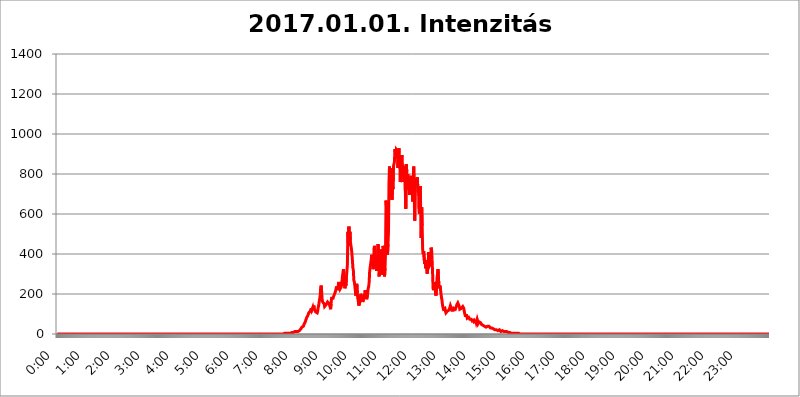
| Category | 2017.01.01. Intenzitás [W/m^2] |
|---|---|
| 0.0 | 0 |
| 0.0006944444444444445 | 0 |
| 0.001388888888888889 | 0 |
| 0.0020833333333333333 | 0 |
| 0.002777777777777778 | 0 |
| 0.003472222222222222 | 0 |
| 0.004166666666666667 | 0 |
| 0.004861111111111111 | 0 |
| 0.005555555555555556 | 0 |
| 0.0062499999999999995 | 0 |
| 0.006944444444444444 | 0 |
| 0.007638888888888889 | 0 |
| 0.008333333333333333 | 0 |
| 0.009027777777777779 | 0 |
| 0.009722222222222222 | 0 |
| 0.010416666666666666 | 0 |
| 0.011111111111111112 | 0 |
| 0.011805555555555555 | 0 |
| 0.012499999999999999 | 0 |
| 0.013194444444444444 | 0 |
| 0.013888888888888888 | 0 |
| 0.014583333333333332 | 0 |
| 0.015277777777777777 | 0 |
| 0.015972222222222224 | 0 |
| 0.016666666666666666 | 0 |
| 0.017361111111111112 | 0 |
| 0.018055555555555557 | 0 |
| 0.01875 | 0 |
| 0.019444444444444445 | 0 |
| 0.02013888888888889 | 0 |
| 0.020833333333333332 | 0 |
| 0.02152777777777778 | 0 |
| 0.022222222222222223 | 0 |
| 0.02291666666666667 | 0 |
| 0.02361111111111111 | 0 |
| 0.024305555555555556 | 0 |
| 0.024999999999999998 | 0 |
| 0.025694444444444447 | 0 |
| 0.02638888888888889 | 0 |
| 0.027083333333333334 | 0 |
| 0.027777777777777776 | 0 |
| 0.02847222222222222 | 0 |
| 0.029166666666666664 | 0 |
| 0.029861111111111113 | 0 |
| 0.030555555555555555 | 0 |
| 0.03125 | 0 |
| 0.03194444444444445 | 0 |
| 0.03263888888888889 | 0 |
| 0.03333333333333333 | 0 |
| 0.034027777777777775 | 0 |
| 0.034722222222222224 | 0 |
| 0.035416666666666666 | 0 |
| 0.036111111111111115 | 0 |
| 0.03680555555555556 | 0 |
| 0.0375 | 0 |
| 0.03819444444444444 | 0 |
| 0.03888888888888889 | 0 |
| 0.03958333333333333 | 0 |
| 0.04027777777777778 | 0 |
| 0.04097222222222222 | 0 |
| 0.041666666666666664 | 0 |
| 0.042361111111111106 | 0 |
| 0.04305555555555556 | 0 |
| 0.043750000000000004 | 0 |
| 0.044444444444444446 | 0 |
| 0.04513888888888889 | 0 |
| 0.04583333333333334 | 0 |
| 0.04652777777777778 | 0 |
| 0.04722222222222222 | 0 |
| 0.04791666666666666 | 0 |
| 0.04861111111111111 | 0 |
| 0.049305555555555554 | 0 |
| 0.049999999999999996 | 0 |
| 0.05069444444444445 | 0 |
| 0.051388888888888894 | 0 |
| 0.052083333333333336 | 0 |
| 0.05277777777777778 | 0 |
| 0.05347222222222222 | 0 |
| 0.05416666666666667 | 0 |
| 0.05486111111111111 | 0 |
| 0.05555555555555555 | 0 |
| 0.05625 | 0 |
| 0.05694444444444444 | 0 |
| 0.057638888888888885 | 0 |
| 0.05833333333333333 | 0 |
| 0.05902777777777778 | 0 |
| 0.059722222222222225 | 0 |
| 0.06041666666666667 | 0 |
| 0.061111111111111116 | 0 |
| 0.06180555555555556 | 0 |
| 0.0625 | 0 |
| 0.06319444444444444 | 0 |
| 0.06388888888888888 | 0 |
| 0.06458333333333334 | 0 |
| 0.06527777777777778 | 0 |
| 0.06597222222222222 | 0 |
| 0.06666666666666667 | 0 |
| 0.06736111111111111 | 0 |
| 0.06805555555555555 | 0 |
| 0.06874999999999999 | 0 |
| 0.06944444444444443 | 0 |
| 0.07013888888888889 | 0 |
| 0.07083333333333333 | 0 |
| 0.07152777777777779 | 0 |
| 0.07222222222222223 | 0 |
| 0.07291666666666667 | 0 |
| 0.07361111111111111 | 0 |
| 0.07430555555555556 | 0 |
| 0.075 | 0 |
| 0.07569444444444444 | 0 |
| 0.0763888888888889 | 0 |
| 0.07708333333333334 | 0 |
| 0.07777777777777778 | 0 |
| 0.07847222222222222 | 0 |
| 0.07916666666666666 | 0 |
| 0.0798611111111111 | 0 |
| 0.08055555555555556 | 0 |
| 0.08125 | 0 |
| 0.08194444444444444 | 0 |
| 0.08263888888888889 | 0 |
| 0.08333333333333333 | 0 |
| 0.08402777777777777 | 0 |
| 0.08472222222222221 | 0 |
| 0.08541666666666665 | 0 |
| 0.08611111111111112 | 0 |
| 0.08680555555555557 | 0 |
| 0.08750000000000001 | 0 |
| 0.08819444444444445 | 0 |
| 0.08888888888888889 | 0 |
| 0.08958333333333333 | 0 |
| 0.09027777777777778 | 0 |
| 0.09097222222222222 | 0 |
| 0.09166666666666667 | 0 |
| 0.09236111111111112 | 0 |
| 0.09305555555555556 | 0 |
| 0.09375 | 0 |
| 0.09444444444444444 | 0 |
| 0.09513888888888888 | 0 |
| 0.09583333333333333 | 0 |
| 0.09652777777777777 | 0 |
| 0.09722222222222222 | 0 |
| 0.09791666666666667 | 0 |
| 0.09861111111111111 | 0 |
| 0.09930555555555555 | 0 |
| 0.09999999999999999 | 0 |
| 0.10069444444444443 | 0 |
| 0.1013888888888889 | 0 |
| 0.10208333333333335 | 0 |
| 0.10277777777777779 | 0 |
| 0.10347222222222223 | 0 |
| 0.10416666666666667 | 0 |
| 0.10486111111111111 | 0 |
| 0.10555555555555556 | 0 |
| 0.10625 | 0 |
| 0.10694444444444444 | 0 |
| 0.1076388888888889 | 0 |
| 0.10833333333333334 | 0 |
| 0.10902777777777778 | 0 |
| 0.10972222222222222 | 0 |
| 0.1111111111111111 | 0 |
| 0.11180555555555556 | 0 |
| 0.11180555555555556 | 0 |
| 0.1125 | 0 |
| 0.11319444444444444 | 0 |
| 0.11388888888888889 | 0 |
| 0.11458333333333333 | 0 |
| 0.11527777777777777 | 0 |
| 0.11597222222222221 | 0 |
| 0.11666666666666665 | 0 |
| 0.1173611111111111 | 0 |
| 0.11805555555555557 | 0 |
| 0.11944444444444445 | 0 |
| 0.12013888888888889 | 0 |
| 0.12083333333333333 | 0 |
| 0.12152777777777778 | 0 |
| 0.12222222222222223 | 0 |
| 0.12291666666666667 | 0 |
| 0.12291666666666667 | 0 |
| 0.12361111111111112 | 0 |
| 0.12430555555555556 | 0 |
| 0.125 | 0 |
| 0.12569444444444444 | 0 |
| 0.12638888888888888 | 0 |
| 0.12708333333333333 | 0 |
| 0.16875 | 0 |
| 0.12847222222222224 | 0 |
| 0.12916666666666668 | 0 |
| 0.12986111111111112 | 0 |
| 0.13055555555555556 | 0 |
| 0.13125 | 0 |
| 0.13194444444444445 | 0 |
| 0.1326388888888889 | 0 |
| 0.13333333333333333 | 0 |
| 0.13402777777777777 | 0 |
| 0.13402777777777777 | 0 |
| 0.13472222222222222 | 0 |
| 0.13541666666666666 | 0 |
| 0.1361111111111111 | 0 |
| 0.13749999999999998 | 0 |
| 0.13819444444444443 | 0 |
| 0.1388888888888889 | 0 |
| 0.13958333333333334 | 0 |
| 0.14027777777777778 | 0 |
| 0.14097222222222222 | 0 |
| 0.14166666666666666 | 0 |
| 0.1423611111111111 | 0 |
| 0.14305555555555557 | 0 |
| 0.14375000000000002 | 0 |
| 0.14444444444444446 | 0 |
| 0.1451388888888889 | 0 |
| 0.1451388888888889 | 0 |
| 0.14652777777777778 | 0 |
| 0.14722222222222223 | 0 |
| 0.14791666666666667 | 0 |
| 0.1486111111111111 | 0 |
| 0.14930555555555555 | 0 |
| 0.15 | 0 |
| 0.15069444444444444 | 0 |
| 0.15138888888888888 | 0 |
| 0.15208333333333332 | 0 |
| 0.15277777777777776 | 0 |
| 0.15347222222222223 | 0 |
| 0.15416666666666667 | 0 |
| 0.15486111111111112 | 0 |
| 0.15555555555555556 | 0 |
| 0.15625 | 0 |
| 0.15694444444444444 | 0 |
| 0.15763888888888888 | 0 |
| 0.15833333333333333 | 0 |
| 0.15902777777777777 | 0 |
| 0.15972222222222224 | 0 |
| 0.16041666666666668 | 0 |
| 0.16111111111111112 | 0 |
| 0.16180555555555556 | 0 |
| 0.1625 | 0 |
| 0.16319444444444445 | 0 |
| 0.1638888888888889 | 0 |
| 0.16458333333333333 | 0 |
| 0.16527777777777777 | 0 |
| 0.16597222222222222 | 0 |
| 0.16666666666666666 | 0 |
| 0.1673611111111111 | 0 |
| 0.16805555555555554 | 0 |
| 0.16874999999999998 | 0 |
| 0.16944444444444443 | 0 |
| 0.17013888888888887 | 0 |
| 0.1708333333333333 | 0 |
| 0.17152777777777775 | 0 |
| 0.17222222222222225 | 0 |
| 0.1729166666666667 | 0 |
| 0.17361111111111113 | 0 |
| 0.17430555555555557 | 0 |
| 0.17500000000000002 | 0 |
| 0.17569444444444446 | 0 |
| 0.1763888888888889 | 0 |
| 0.17708333333333334 | 0 |
| 0.17777777777777778 | 0 |
| 0.17847222222222223 | 0 |
| 0.17916666666666667 | 0 |
| 0.1798611111111111 | 0 |
| 0.18055555555555555 | 0 |
| 0.18125 | 0 |
| 0.18194444444444444 | 0 |
| 0.1826388888888889 | 0 |
| 0.18333333333333335 | 0 |
| 0.1840277777777778 | 0 |
| 0.18472222222222223 | 0 |
| 0.18541666666666667 | 0 |
| 0.18611111111111112 | 0 |
| 0.18680555555555556 | 0 |
| 0.1875 | 0 |
| 0.18819444444444444 | 0 |
| 0.18888888888888888 | 0 |
| 0.18958333333333333 | 0 |
| 0.19027777777777777 | 0 |
| 0.1909722222222222 | 0 |
| 0.19166666666666665 | 0 |
| 0.19236111111111112 | 0 |
| 0.19305555555555554 | 0 |
| 0.19375 | 0 |
| 0.19444444444444445 | 0 |
| 0.1951388888888889 | 0 |
| 0.19583333333333333 | 0 |
| 0.19652777777777777 | 0 |
| 0.19722222222222222 | 0 |
| 0.19791666666666666 | 0 |
| 0.1986111111111111 | 0 |
| 0.19930555555555554 | 0 |
| 0.19999999999999998 | 0 |
| 0.20069444444444443 | 0 |
| 0.20138888888888887 | 0 |
| 0.2020833333333333 | 0 |
| 0.2027777777777778 | 0 |
| 0.2034722222222222 | 0 |
| 0.2041666666666667 | 0 |
| 0.20486111111111113 | 0 |
| 0.20555555555555557 | 0 |
| 0.20625000000000002 | 0 |
| 0.20694444444444446 | 0 |
| 0.2076388888888889 | 0 |
| 0.20833333333333334 | 0 |
| 0.20902777777777778 | 0 |
| 0.20972222222222223 | 0 |
| 0.21041666666666667 | 0 |
| 0.2111111111111111 | 0 |
| 0.21180555555555555 | 0 |
| 0.2125 | 0 |
| 0.21319444444444444 | 0 |
| 0.2138888888888889 | 0 |
| 0.21458333333333335 | 0 |
| 0.2152777777777778 | 0 |
| 0.21597222222222223 | 0 |
| 0.21666666666666667 | 0 |
| 0.21736111111111112 | 0 |
| 0.21805555555555556 | 0 |
| 0.21875 | 0 |
| 0.21944444444444444 | 0 |
| 0.22013888888888888 | 0 |
| 0.22083333333333333 | 0 |
| 0.22152777777777777 | 0 |
| 0.2222222222222222 | 0 |
| 0.22291666666666665 | 0 |
| 0.2236111111111111 | 0 |
| 0.22430555555555556 | 0 |
| 0.225 | 0 |
| 0.22569444444444445 | 0 |
| 0.2263888888888889 | 0 |
| 0.22708333333333333 | 0 |
| 0.22777777777777777 | 0 |
| 0.22847222222222222 | 0 |
| 0.22916666666666666 | 0 |
| 0.2298611111111111 | 0 |
| 0.23055555555555554 | 0 |
| 0.23124999999999998 | 0 |
| 0.23194444444444443 | 0 |
| 0.23263888888888887 | 0 |
| 0.2333333333333333 | 0 |
| 0.2340277777777778 | 0 |
| 0.2347222222222222 | 0 |
| 0.2354166666666667 | 0 |
| 0.23611111111111113 | 0 |
| 0.23680555555555557 | 0 |
| 0.23750000000000002 | 0 |
| 0.23819444444444446 | 0 |
| 0.2388888888888889 | 0 |
| 0.23958333333333334 | 0 |
| 0.24027777777777778 | 0 |
| 0.24097222222222223 | 0 |
| 0.24166666666666667 | 0 |
| 0.2423611111111111 | 0 |
| 0.24305555555555555 | 0 |
| 0.24375 | 0 |
| 0.24444444444444446 | 0 |
| 0.24513888888888888 | 0 |
| 0.24583333333333335 | 0 |
| 0.2465277777777778 | 0 |
| 0.24722222222222223 | 0 |
| 0.24791666666666667 | 0 |
| 0.24861111111111112 | 0 |
| 0.24930555555555556 | 0 |
| 0.25 | 0 |
| 0.25069444444444444 | 0 |
| 0.2513888888888889 | 0 |
| 0.2520833333333333 | 0 |
| 0.25277777777777777 | 0 |
| 0.2534722222222222 | 0 |
| 0.25416666666666665 | 0 |
| 0.2548611111111111 | 0 |
| 0.2555555555555556 | 0 |
| 0.25625000000000003 | 0 |
| 0.2569444444444445 | 0 |
| 0.2576388888888889 | 0 |
| 0.25833333333333336 | 0 |
| 0.2590277777777778 | 0 |
| 0.25972222222222224 | 0 |
| 0.2604166666666667 | 0 |
| 0.2611111111111111 | 0 |
| 0.26180555555555557 | 0 |
| 0.2625 | 0 |
| 0.26319444444444445 | 0 |
| 0.2638888888888889 | 0 |
| 0.26458333333333334 | 0 |
| 0.2652777777777778 | 0 |
| 0.2659722222222222 | 0 |
| 0.26666666666666666 | 0 |
| 0.2673611111111111 | 0 |
| 0.26805555555555555 | 0 |
| 0.26875 | 0 |
| 0.26944444444444443 | 0 |
| 0.2701388888888889 | 0 |
| 0.2708333333333333 | 0 |
| 0.27152777777777776 | 0 |
| 0.2722222222222222 | 0 |
| 0.27291666666666664 | 0 |
| 0.2736111111111111 | 0 |
| 0.2743055555555555 | 0 |
| 0.27499999999999997 | 0 |
| 0.27569444444444446 | 0 |
| 0.27638888888888885 | 0 |
| 0.27708333333333335 | 0 |
| 0.2777777777777778 | 0 |
| 0.27847222222222223 | 0 |
| 0.2791666666666667 | 0 |
| 0.2798611111111111 | 0 |
| 0.28055555555555556 | 0 |
| 0.28125 | 0 |
| 0.28194444444444444 | 0 |
| 0.2826388888888889 | 0 |
| 0.2833333333333333 | 0 |
| 0.28402777777777777 | 0 |
| 0.2847222222222222 | 0 |
| 0.28541666666666665 | 0 |
| 0.28611111111111115 | 0 |
| 0.28680555555555554 | 0 |
| 0.28750000000000003 | 0 |
| 0.2881944444444445 | 0 |
| 0.2888888888888889 | 0 |
| 0.28958333333333336 | 0 |
| 0.2902777777777778 | 0 |
| 0.29097222222222224 | 0 |
| 0.2916666666666667 | 0 |
| 0.2923611111111111 | 0 |
| 0.29305555555555557 | 0 |
| 0.29375 | 0 |
| 0.29444444444444445 | 0 |
| 0.2951388888888889 | 0 |
| 0.29583333333333334 | 0 |
| 0.2965277777777778 | 0 |
| 0.2972222222222222 | 0 |
| 0.29791666666666666 | 0 |
| 0.2986111111111111 | 0 |
| 0.29930555555555555 | 0 |
| 0.3 | 0 |
| 0.30069444444444443 | 0 |
| 0.3013888888888889 | 0 |
| 0.3020833333333333 | 0 |
| 0.30277777777777776 | 0 |
| 0.3034722222222222 | 0 |
| 0.30416666666666664 | 0 |
| 0.3048611111111111 | 0 |
| 0.3055555555555555 | 0 |
| 0.30624999999999997 | 0 |
| 0.3069444444444444 | 0 |
| 0.3076388888888889 | 0 |
| 0.30833333333333335 | 0 |
| 0.3090277777777778 | 0 |
| 0.30972222222222223 | 0 |
| 0.3104166666666667 | 0 |
| 0.3111111111111111 | 0 |
| 0.31180555555555556 | 0 |
| 0.3125 | 0 |
| 0.31319444444444444 | 0 |
| 0.3138888888888889 | 0 |
| 0.3145833333333333 | 0 |
| 0.31527777777777777 | 0 |
| 0.3159722222222222 | 0 |
| 0.31666666666666665 | 0 |
| 0.31736111111111115 | 3.525 |
| 0.31805555555555554 | 3.525 |
| 0.31875000000000003 | 3.525 |
| 0.3194444444444445 | 3.525 |
| 0.3201388888888889 | 3.525 |
| 0.32083333333333336 | 3.525 |
| 0.3215277777777778 | 3.525 |
| 0.32222222222222224 | 3.525 |
| 0.3229166666666667 | 3.525 |
| 0.3236111111111111 | 3.525 |
| 0.32430555555555557 | 3.525 |
| 0.325 | 3.525 |
| 0.32569444444444445 | 3.525 |
| 0.3263888888888889 | 7.887 |
| 0.32708333333333334 | 3.525 |
| 0.3277777777777778 | 7.887 |
| 0.3284722222222222 | 7.887 |
| 0.32916666666666666 | 7.887 |
| 0.3298611111111111 | 7.887 |
| 0.33055555555555555 | 7.887 |
| 0.33125 | 7.887 |
| 0.33194444444444443 | 12.257 |
| 0.3326388888888889 | 12.257 |
| 0.3333333333333333 | 12.257 |
| 0.3340277777777778 | 12.257 |
| 0.3347222222222222 | 12.257 |
| 0.3354166666666667 | 12.257 |
| 0.3361111111111111 | 12.257 |
| 0.3368055555555556 | 12.257 |
| 0.33749999999999997 | 12.257 |
| 0.33819444444444446 | 16.636 |
| 0.33888888888888885 | 16.636 |
| 0.33958333333333335 | 16.636 |
| 0.34027777777777773 | 21.024 |
| 0.34097222222222223 | 21.024 |
| 0.3416666666666666 | 25.419 |
| 0.3423611111111111 | 29.823 |
| 0.3430555555555555 | 34.234 |
| 0.34375 | 38.653 |
| 0.3444444444444445 | 34.234 |
| 0.3451388888888889 | 38.653 |
| 0.3458333333333334 | 38.653 |
| 0.34652777777777777 | 51.951 |
| 0.34722222222222227 | 56.398 |
| 0.34791666666666665 | 60.85 |
| 0.34861111111111115 | 69.775 |
| 0.34930555555555554 | 74.246 |
| 0.35000000000000003 | 83.205 |
| 0.3506944444444444 | 87.692 |
| 0.3513888888888889 | 92.184 |
| 0.3520833333333333 | 96.682 |
| 0.3527777777777778 | 105.69 |
| 0.3534722222222222 | 110.201 |
| 0.3541666666666667 | 110.201 |
| 0.3548611111111111 | 114.716 |
| 0.35555555555555557 | 105.69 |
| 0.35625 | 128.284 |
| 0.35694444444444445 | 119.235 |
| 0.3576388888888889 | 123.758 |
| 0.35833333333333334 | 132.814 |
| 0.3590277777777778 | 119.235 |
| 0.3597222222222222 | 141.884 |
| 0.36041666666666666 | 128.284 |
| 0.3611111111111111 | 119.235 |
| 0.36180555555555555 | 119.235 |
| 0.3625 | 110.201 |
| 0.36319444444444443 | 105.69 |
| 0.3638888888888889 | 105.69 |
| 0.3645833333333333 | 105.69 |
| 0.3652777777777778 | 114.716 |
| 0.3659722222222222 | 132.814 |
| 0.3666666666666667 | 141.884 |
| 0.3673611111111111 | 160.056 |
| 0.3680555555555556 | 173.709 |
| 0.36874999999999997 | 191.937 |
| 0.36944444444444446 | 228.436 |
| 0.37013888888888885 | 242.127 |
| 0.37083333333333335 | 210.182 |
| 0.37152777777777773 | 173.709 |
| 0.37222222222222223 | 160.056 |
| 0.3729166666666666 | 164.605 |
| 0.3736111111111111 | 155.509 |
| 0.3743055555555555 | 150.964 |
| 0.375 | 137.347 |
| 0.3756944444444445 | 132.814 |
| 0.3763888888888889 | 132.814 |
| 0.3770833333333334 | 146.423 |
| 0.37777777777777777 | 146.423 |
| 0.37847222222222227 | 150.964 |
| 0.37916666666666665 | 160.056 |
| 0.37986111111111115 | 160.056 |
| 0.38055555555555554 | 155.509 |
| 0.38125000000000003 | 150.964 |
| 0.3819444444444444 | 160.056 |
| 0.3826388888888889 | 137.347 |
| 0.3833333333333333 | 123.758 |
| 0.3840277777777778 | 150.964 |
| 0.3847222222222222 | 178.264 |
| 0.3854166666666667 | 173.709 |
| 0.3861111111111111 | 173.709 |
| 0.38680555555555557 | 178.264 |
| 0.3875 | 187.378 |
| 0.38819444444444445 | 182.82 |
| 0.3888888888888889 | 191.937 |
| 0.38958333333333334 | 205.62 |
| 0.3902777777777778 | 210.182 |
| 0.3909722222222222 | 223.873 |
| 0.39166666666666666 | 237.564 |
| 0.3923611111111111 | 237.564 |
| 0.39305555555555555 | 219.309 |
| 0.39375 | 233 |
| 0.39444444444444443 | 251.251 |
| 0.3951388888888889 | 260.373 |
| 0.3958333333333333 | 233 |
| 0.3965277777777778 | 223.873 |
| 0.3972222222222222 | 223.873 |
| 0.3979166666666667 | 233 |
| 0.3986111111111111 | 242.127 |
| 0.3993055555555556 | 260.373 |
| 0.39999999999999997 | 287.709 |
| 0.40069444444444446 | 287.709 |
| 0.40138888888888885 | 324.052 |
| 0.40208333333333335 | 292.259 |
| 0.40277777777777773 | 251.251 |
| 0.40347222222222223 | 228.436 |
| 0.4041666666666666 | 251.251 |
| 0.4048611111111111 | 242.127 |
| 0.4055555555555555 | 283.156 |
| 0.40625 | 314.98 |
| 0.4069444444444445 | 346.682 |
| 0.4076388888888889 | 510.885 |
| 0.4083333333333334 | 453.968 |
| 0.40902777777777777 | 536.82 |
| 0.40972222222222227 | 440.702 |
| 0.41041666666666665 | 510.885 |
| 0.41111111111111115 | 462.786 |
| 0.41180555555555554 | 458.38 |
| 0.41250000000000003 | 427.39 |
| 0.4131944444444444 | 405.108 |
| 0.4138888888888889 | 373.729 |
| 0.4145833333333333 | 333.113 |
| 0.4152777777777778 | 319.517 |
| 0.4159722222222222 | 269.49 |
| 0.4166666666666667 | 260.373 |
| 0.4173611111111111 | 255.813 |
| 0.41805555555555557 | 219.309 |
| 0.41875 | 191.937 |
| 0.41944444444444445 | 210.182 |
| 0.4201388888888889 | 251.251 |
| 0.42083333333333334 | 201.058 |
| 0.4215277777777778 | 178.264 |
| 0.4222222222222222 | 164.605 |
| 0.42291666666666666 | 141.884 |
| 0.4236111111111111 | 141.884 |
| 0.42430555555555555 | 141.884 |
| 0.425 | 169.156 |
| 0.42569444444444443 | 201.058 |
| 0.4263888888888889 | 205.62 |
| 0.4270833333333333 | 201.058 |
| 0.4277777777777778 | 173.709 |
| 0.4284722222222222 | 160.056 |
| 0.4291666666666667 | 164.605 |
| 0.4298611111111111 | 178.264 |
| 0.4305555555555556 | 191.937 |
| 0.43124999999999997 | 201.058 |
| 0.43194444444444446 | 219.309 |
| 0.43263888888888885 | 196.497 |
| 0.43333333333333335 | 187.378 |
| 0.43402777777777773 | 173.709 |
| 0.43472222222222223 | 178.264 |
| 0.4354166666666666 | 205.62 |
| 0.4361111111111111 | 228.436 |
| 0.4368055555555555 | 237.564 |
| 0.4375 | 260.373 |
| 0.4381944444444445 | 314.98 |
| 0.4388888888888889 | 333.113 |
| 0.4395833333333334 | 333.113 |
| 0.44027777777777777 | 369.23 |
| 0.44097222222222227 | 396.164 |
| 0.44166666666666665 | 396.164 |
| 0.44236111111111115 | 355.712 |
| 0.44305555555555554 | 324.052 |
| 0.44375000000000003 | 346.682 |
| 0.4444444444444444 | 431.833 |
| 0.4451388888888889 | 440.702 |
| 0.4458333333333333 | 405.108 |
| 0.4465277777777778 | 382.715 |
| 0.4472222222222222 | 378.224 |
| 0.4479166666666667 | 314.98 |
| 0.4486111111111111 | 310.44 |
| 0.44930555555555557 | 373.729 |
| 0.45 | 449.551 |
| 0.45069444444444445 | 360.221 |
| 0.4513888888888889 | 287.709 |
| 0.45208333333333334 | 292.259 |
| 0.4527777777777778 | 337.639 |
| 0.4534722222222222 | 422.943 |
| 0.45416666666666666 | 342.162 |
| 0.4548611111111111 | 310.44 |
| 0.45555555555555555 | 296.808 |
| 0.45625 | 355.712 |
| 0.45694444444444443 | 440.702 |
| 0.4576388888888889 | 422.943 |
| 0.4583333333333333 | 337.639 |
| 0.4590277777777778 | 287.709 |
| 0.4597222222222222 | 328.584 |
| 0.4604166666666667 | 414.035 |
| 0.4611111111111111 | 667.123 |
| 0.4618055555555556 | 634.105 |
| 0.46249999999999997 | 414.035 |
| 0.46319444444444446 | 396.164 |
| 0.46388888888888885 | 449.551 |
| 0.46458333333333335 | 510.885 |
| 0.46527777777777773 | 759.723 |
| 0.46597222222222223 | 837.682 |
| 0.4666666666666666 | 735.89 |
| 0.4673611111111111 | 691.608 |
| 0.4680555555555555 | 727.896 |
| 0.46875 | 829.981 |
| 0.4694444444444445 | 671.22 |
| 0.4701388888888889 | 743.859 |
| 0.4708333333333334 | 723.889 |
| 0.47152777777777777 | 837.682 |
| 0.47222222222222227 | 837.682 |
| 0.47291666666666665 | 860.676 |
| 0.47361111111111115 | 925.06 |
| 0.47430555555555554 | 909.996 |
| 0.47500000000000003 | 883.516 |
| 0.4756944444444444 | 921.298 |
| 0.4763888888888889 | 925.06 |
| 0.4770833333333333 | 913.766 |
| 0.4777777777777778 | 829.981 |
| 0.4784722222222222 | 883.516 |
| 0.4791666666666667 | 928.819 |
| 0.4798611111111111 | 853.029 |
| 0.48055555555555557 | 891.099 |
| 0.48125 | 759.723 |
| 0.48194444444444445 | 775.492 |
| 0.4826388888888889 | 872.114 |
| 0.48333333333333334 | 894.885 |
| 0.4840277777777778 | 818.392 |
| 0.4847222222222222 | 829.981 |
| 0.48541666666666666 | 822.26 |
| 0.4861111111111111 | 759.723 |
| 0.48680555555555555 | 814.519 |
| 0.4875 | 841.526 |
| 0.48819444444444443 | 719.877 |
| 0.4888888888888889 | 625.784 |
| 0.4895833333333333 | 849.199 |
| 0.4902777777777778 | 806.757 |
| 0.4909722222222222 | 727.896 |
| 0.4916666666666667 | 798.974 |
| 0.4923611111111111 | 731.896 |
| 0.4930555555555556 | 723.889 |
| 0.49374999999999997 | 731.896 |
| 0.49444444444444446 | 695.666 |
| 0.49513888888888885 | 691.608 |
| 0.49583333333333335 | 783.342 |
| 0.49652777777777773 | 791.169 |
| 0.49722222222222223 | 759.723 |
| 0.4979166666666666 | 787.258 |
| 0.4986111111111111 | 663.019 |
| 0.4993055555555555 | 763.674 |
| 0.5 | 837.682 |
| 0.5006944444444444 | 695.666 |
| 0.5013888888888889 | 566.793 |
| 0.5020833333333333 | 779.42 |
| 0.5027777777777778 | 759.723 |
| 0.5034722222222222 | 767.62 |
| 0.5041666666666667 | 743.859 |
| 0.5048611111111111 | 783.342 |
| 0.5055555555555555 | 743.859 |
| 0.50625 | 707.8 |
| 0.5069444444444444 | 735.89 |
| 0.5076388888888889 | 609.062 |
| 0.5083333333333333 | 600.661 |
| 0.5090277777777777 | 739.877 |
| 0.5097222222222222 | 621.613 |
| 0.5104166666666666 | 480.356 |
| 0.5111111111111112 | 634.105 |
| 0.5118055555555555 | 541.121 |
| 0.5125000000000001 | 422.943 |
| 0.5131944444444444 | 400.638 |
| 0.513888888888889 | 414.035 |
| 0.5145833333333333 | 418.492 |
| 0.5152777777777778 | 351.198 |
| 0.5159722222222222 | 369.23 |
| 0.5166666666666667 | 328.584 |
| 0.517361111111111 | 346.682 |
| 0.5180555555555556 | 328.584 |
| 0.5187499999999999 | 301.354 |
| 0.5194444444444445 | 296.808 |
| 0.5201388888888888 | 342.162 |
| 0.5208333333333334 | 409.574 |
| 0.5215277777777778 | 378.224 |
| 0.5222222222222223 | 342.162 |
| 0.5229166666666667 | 337.639 |
| 0.5236111111111111 | 351.198 |
| 0.5243055555555556 | 431.833 |
| 0.525 | 422.943 |
| 0.5256944444444445 | 373.729 |
| 0.5263888888888889 | 310.44 |
| 0.5270833333333333 | 228.436 |
| 0.5277777777777778 | 219.309 |
| 0.5284722222222222 | 242.127 |
| 0.5291666666666667 | 260.373 |
| 0.5298611111111111 | 242.127 |
| 0.5305555555555556 | 201.058 |
| 0.53125 | 191.937 |
| 0.5319444444444444 | 228.436 |
| 0.5326388888888889 | 278.603 |
| 0.5333333333333333 | 301.354 |
| 0.5340277777777778 | 324.052 |
| 0.5347222222222222 | 324.052 |
| 0.5354166666666667 | 228.436 |
| 0.5361111111111111 | 228.436 |
| 0.5368055555555555 | 242.127 |
| 0.5375 | 223.873 |
| 0.5381944444444444 | 201.058 |
| 0.5388888888888889 | 182.82 |
| 0.5395833333333333 | 169.156 |
| 0.5402777777777777 | 146.423 |
| 0.5409722222222222 | 132.814 |
| 0.5416666666666666 | 123.758 |
| 0.5423611111111112 | 128.284 |
| 0.5430555555555555 | 128.284 |
| 0.5437500000000001 | 128.284 |
| 0.5444444444444444 | 114.716 |
| 0.545138888888889 | 105.69 |
| 0.5458333333333333 | 105.69 |
| 0.5465277777777778 | 110.201 |
| 0.5472222222222222 | 114.716 |
| 0.5479166666666667 | 119.235 |
| 0.548611111111111 | 119.235 |
| 0.5493055555555556 | 119.235 |
| 0.5499999999999999 | 119.235 |
| 0.5506944444444445 | 132.814 |
| 0.5513888888888888 | 141.884 |
| 0.5520833333333334 | 137.347 |
| 0.5527777777777778 | 128.284 |
| 0.5534722222222223 | 119.235 |
| 0.5541666666666667 | 114.716 |
| 0.5548611111111111 | 114.716 |
| 0.5555555555555556 | 119.235 |
| 0.55625 | 128.284 |
| 0.5569444444444445 | 128.284 |
| 0.5576388888888889 | 123.758 |
| 0.5583333333333333 | 123.758 |
| 0.5590277777777778 | 128.284 |
| 0.5597222222222222 | 137.347 |
| 0.5604166666666667 | 146.423 |
| 0.5611111111111111 | 146.423 |
| 0.5618055555555556 | 155.509 |
| 0.5625 | 150.964 |
| 0.5631944444444444 | 150.964 |
| 0.5638888888888889 | 137.347 |
| 0.5645833333333333 | 123.758 |
| 0.5652777777777778 | 128.284 |
| 0.5659722222222222 | 128.284 |
| 0.5666666666666667 | 128.284 |
| 0.5673611111111111 | 128.284 |
| 0.5680555555555555 | 132.814 |
| 0.56875 | 137.347 |
| 0.5694444444444444 | 132.814 |
| 0.5701388888888889 | 128.284 |
| 0.5708333333333333 | 114.716 |
| 0.5715277777777777 | 101.184 |
| 0.5722222222222222 | 92.184 |
| 0.5729166666666666 | 87.692 |
| 0.5736111111111112 | 92.184 |
| 0.5743055555555555 | 92.184 |
| 0.5750000000000001 | 78.722 |
| 0.5756944444444444 | 74.246 |
| 0.576388888888889 | 78.722 |
| 0.5770833333333333 | 83.205 |
| 0.5777777777777778 | 78.722 |
| 0.5784722222222222 | 74.246 |
| 0.5791666666666667 | 74.246 |
| 0.579861111111111 | 78.722 |
| 0.5805555555555556 | 74.246 |
| 0.5812499999999999 | 69.775 |
| 0.5819444444444445 | 65.31 |
| 0.5826388888888888 | 65.31 |
| 0.5833333333333334 | 69.775 |
| 0.5840277777777778 | 69.775 |
| 0.5847222222222223 | 60.85 |
| 0.5854166666666667 | 60.85 |
| 0.5861111111111111 | 60.85 |
| 0.5868055555555556 | 65.31 |
| 0.5875 | 56.398 |
| 0.5881944444444445 | 56.398 |
| 0.5888888888888889 | 74.246 |
| 0.5895833333333333 | 65.31 |
| 0.5902777777777778 | 51.951 |
| 0.5909722222222222 | 56.398 |
| 0.5916666666666667 | 60.85 |
| 0.5923611111111111 | 60.85 |
| 0.5930555555555556 | 56.398 |
| 0.59375 | 56.398 |
| 0.5944444444444444 | 56.398 |
| 0.5951388888888889 | 47.511 |
| 0.5958333333333333 | 47.511 |
| 0.5965277777777778 | 43.079 |
| 0.5972222222222222 | 43.079 |
| 0.5979166666666667 | 38.653 |
| 0.5986111111111111 | 38.653 |
| 0.5993055555555555 | 38.653 |
| 0.6 | 38.653 |
| 0.6006944444444444 | 34.234 |
| 0.6013888888888889 | 34.234 |
| 0.6020833333333333 | 38.653 |
| 0.6027777777777777 | 38.653 |
| 0.6034722222222222 | 38.653 |
| 0.6041666666666666 | 38.653 |
| 0.6048611111111112 | 38.653 |
| 0.6055555555555555 | 38.653 |
| 0.6062500000000001 | 38.653 |
| 0.6069444444444444 | 34.234 |
| 0.607638888888889 | 29.823 |
| 0.6083333333333333 | 29.823 |
| 0.6090277777777778 | 29.823 |
| 0.6097222222222222 | 29.823 |
| 0.6104166666666667 | 25.419 |
| 0.611111111111111 | 25.419 |
| 0.6118055555555556 | 25.419 |
| 0.6124999999999999 | 25.419 |
| 0.6131944444444445 | 21.024 |
| 0.6138888888888888 | 21.024 |
| 0.6145833333333334 | 21.024 |
| 0.6152777777777778 | 21.024 |
| 0.6159722222222223 | 21.024 |
| 0.6166666666666667 | 21.024 |
| 0.6173611111111111 | 21.024 |
| 0.6180555555555556 | 16.636 |
| 0.61875 | 16.636 |
| 0.6194444444444445 | 16.636 |
| 0.6201388888888889 | 21.024 |
| 0.6208333333333333 | 21.024 |
| 0.6215277777777778 | 16.636 |
| 0.6222222222222222 | 12.257 |
| 0.6229166666666667 | 12.257 |
| 0.6236111111111111 | 16.636 |
| 0.6243055555555556 | 16.636 |
| 0.625 | 12.257 |
| 0.6256944444444444 | 12.257 |
| 0.6263888888888889 | 12.257 |
| 0.6270833333333333 | 12.257 |
| 0.6277777777777778 | 12.257 |
| 0.6284722222222222 | 12.257 |
| 0.6291666666666667 | 12.257 |
| 0.6298611111111111 | 12.257 |
| 0.6305555555555555 | 12.257 |
| 0.63125 | 7.887 |
| 0.6319444444444444 | 7.887 |
| 0.6326388888888889 | 7.887 |
| 0.6333333333333333 | 7.887 |
| 0.6340277777777777 | 7.887 |
| 0.6347222222222222 | 7.887 |
| 0.6354166666666666 | 7.887 |
| 0.6361111111111112 | 7.887 |
| 0.6368055555555555 | 3.525 |
| 0.6375000000000001 | 3.525 |
| 0.6381944444444444 | 3.525 |
| 0.638888888888889 | 3.525 |
| 0.6395833333333333 | 3.525 |
| 0.6402777777777778 | 3.525 |
| 0.6409722222222222 | 3.525 |
| 0.6416666666666667 | 3.525 |
| 0.642361111111111 | 3.525 |
| 0.6430555555555556 | 3.525 |
| 0.6437499999999999 | 3.525 |
| 0.6444444444444445 | 3.525 |
| 0.6451388888888888 | 3.525 |
| 0.6458333333333334 | 3.525 |
| 0.6465277777777778 | 3.525 |
| 0.6472222222222223 | 3.525 |
| 0.6479166666666667 | 3.525 |
| 0.6486111111111111 | 3.525 |
| 0.6493055555555556 | 0 |
| 0.65 | 3.525 |
| 0.6506944444444445 | 0 |
| 0.6513888888888889 | 0 |
| 0.6520833333333333 | 0 |
| 0.6527777777777778 | 0 |
| 0.6534722222222222 | 0 |
| 0.6541666666666667 | 0 |
| 0.6548611111111111 | 0 |
| 0.6555555555555556 | 0 |
| 0.65625 | 0 |
| 0.6569444444444444 | 0 |
| 0.6576388888888889 | 0 |
| 0.6583333333333333 | 0 |
| 0.6590277777777778 | 0 |
| 0.6597222222222222 | 0 |
| 0.6604166666666667 | 0 |
| 0.6611111111111111 | 0 |
| 0.6618055555555555 | 0 |
| 0.6625 | 0 |
| 0.6631944444444444 | 0 |
| 0.6638888888888889 | 0 |
| 0.6645833333333333 | 0 |
| 0.6652777777777777 | 0 |
| 0.6659722222222222 | 0 |
| 0.6666666666666666 | 0 |
| 0.6673611111111111 | 0 |
| 0.6680555555555556 | 0 |
| 0.6687500000000001 | 0 |
| 0.6694444444444444 | 0 |
| 0.6701388888888888 | 0 |
| 0.6708333333333334 | 0 |
| 0.6715277777777778 | 0 |
| 0.6722222222222222 | 0 |
| 0.6729166666666666 | 0 |
| 0.6736111111111112 | 0 |
| 0.6743055555555556 | 0 |
| 0.6749999999999999 | 0 |
| 0.6756944444444444 | 0 |
| 0.6763888888888889 | 0 |
| 0.6770833333333334 | 0 |
| 0.6777777777777777 | 0 |
| 0.6784722222222223 | 0 |
| 0.6791666666666667 | 0 |
| 0.6798611111111111 | 0 |
| 0.6805555555555555 | 0 |
| 0.68125 | 0 |
| 0.6819444444444445 | 0 |
| 0.6826388888888889 | 0 |
| 0.6833333333333332 | 0 |
| 0.6840277777777778 | 0 |
| 0.6847222222222222 | 0 |
| 0.6854166666666667 | 0 |
| 0.686111111111111 | 0 |
| 0.6868055555555556 | 0 |
| 0.6875 | 0 |
| 0.6881944444444444 | 0 |
| 0.688888888888889 | 0 |
| 0.6895833333333333 | 0 |
| 0.6902777777777778 | 0 |
| 0.6909722222222222 | 0 |
| 0.6916666666666668 | 0 |
| 0.6923611111111111 | 0 |
| 0.6930555555555555 | 0 |
| 0.69375 | 0 |
| 0.6944444444444445 | 0 |
| 0.6951388888888889 | 0 |
| 0.6958333333333333 | 0 |
| 0.6965277777777777 | 0 |
| 0.6972222222222223 | 0 |
| 0.6979166666666666 | 0 |
| 0.6986111111111111 | 0 |
| 0.6993055555555556 | 0 |
| 0.7000000000000001 | 0 |
| 0.7006944444444444 | 0 |
| 0.7013888888888888 | 0 |
| 0.7020833333333334 | 0 |
| 0.7027777777777778 | 0 |
| 0.7034722222222222 | 0 |
| 0.7041666666666666 | 0 |
| 0.7048611111111112 | 0 |
| 0.7055555555555556 | 0 |
| 0.7062499999999999 | 0 |
| 0.7069444444444444 | 0 |
| 0.7076388888888889 | 0 |
| 0.7083333333333334 | 0 |
| 0.7090277777777777 | 0 |
| 0.7097222222222223 | 0 |
| 0.7104166666666667 | 0 |
| 0.7111111111111111 | 0 |
| 0.7118055555555555 | 0 |
| 0.7125 | 0 |
| 0.7131944444444445 | 0 |
| 0.7138888888888889 | 0 |
| 0.7145833333333332 | 0 |
| 0.7152777777777778 | 0 |
| 0.7159722222222222 | 0 |
| 0.7166666666666667 | 0 |
| 0.717361111111111 | 0 |
| 0.7180555555555556 | 0 |
| 0.71875 | 0 |
| 0.7194444444444444 | 0 |
| 0.720138888888889 | 0 |
| 0.7208333333333333 | 0 |
| 0.7215277777777778 | 0 |
| 0.7222222222222222 | 0 |
| 0.7229166666666668 | 0 |
| 0.7236111111111111 | 0 |
| 0.7243055555555555 | 0 |
| 0.725 | 0 |
| 0.7256944444444445 | 0 |
| 0.7263888888888889 | 0 |
| 0.7270833333333333 | 0 |
| 0.7277777777777777 | 0 |
| 0.7284722222222223 | 0 |
| 0.7291666666666666 | 0 |
| 0.7298611111111111 | 0 |
| 0.7305555555555556 | 0 |
| 0.7312500000000001 | 0 |
| 0.7319444444444444 | 0 |
| 0.7326388888888888 | 0 |
| 0.7333333333333334 | 0 |
| 0.7340277777777778 | 0 |
| 0.7347222222222222 | 0 |
| 0.7354166666666666 | 0 |
| 0.7361111111111112 | 0 |
| 0.7368055555555556 | 0 |
| 0.7374999999999999 | 0 |
| 0.7381944444444444 | 0 |
| 0.7388888888888889 | 0 |
| 0.7395833333333334 | 0 |
| 0.7402777777777777 | 0 |
| 0.7409722222222223 | 0 |
| 0.7416666666666667 | 0 |
| 0.7423611111111111 | 0 |
| 0.7430555555555555 | 0 |
| 0.74375 | 0 |
| 0.7444444444444445 | 0 |
| 0.7451388888888889 | 0 |
| 0.7458333333333332 | 0 |
| 0.7465277777777778 | 0 |
| 0.7472222222222222 | 0 |
| 0.7479166666666667 | 0 |
| 0.748611111111111 | 0 |
| 0.7493055555555556 | 0 |
| 0.75 | 0 |
| 0.7506944444444444 | 0 |
| 0.751388888888889 | 0 |
| 0.7520833333333333 | 0 |
| 0.7527777777777778 | 0 |
| 0.7534722222222222 | 0 |
| 0.7541666666666668 | 0 |
| 0.7548611111111111 | 0 |
| 0.7555555555555555 | 0 |
| 0.75625 | 0 |
| 0.7569444444444445 | 0 |
| 0.7576388888888889 | 0 |
| 0.7583333333333333 | 0 |
| 0.7590277777777777 | 0 |
| 0.7597222222222223 | 0 |
| 0.7604166666666666 | 0 |
| 0.7611111111111111 | 0 |
| 0.7618055555555556 | 0 |
| 0.7625000000000001 | 0 |
| 0.7631944444444444 | 0 |
| 0.7638888888888888 | 0 |
| 0.7645833333333334 | 0 |
| 0.7652777777777778 | 0 |
| 0.7659722222222222 | 0 |
| 0.7666666666666666 | 0 |
| 0.7673611111111112 | 0 |
| 0.7680555555555556 | 0 |
| 0.7687499999999999 | 0 |
| 0.7694444444444444 | 0 |
| 0.7701388888888889 | 0 |
| 0.7708333333333334 | 0 |
| 0.7715277777777777 | 0 |
| 0.7722222222222223 | 0 |
| 0.7729166666666667 | 0 |
| 0.7736111111111111 | 0 |
| 0.7743055555555555 | 0 |
| 0.775 | 0 |
| 0.7756944444444445 | 0 |
| 0.7763888888888889 | 0 |
| 0.7770833333333332 | 0 |
| 0.7777777777777778 | 0 |
| 0.7784722222222222 | 0 |
| 0.7791666666666667 | 0 |
| 0.779861111111111 | 0 |
| 0.7805555555555556 | 0 |
| 0.78125 | 0 |
| 0.7819444444444444 | 0 |
| 0.782638888888889 | 0 |
| 0.7833333333333333 | 0 |
| 0.7840277777777778 | 0 |
| 0.7847222222222222 | 0 |
| 0.7854166666666668 | 0 |
| 0.7861111111111111 | 0 |
| 0.7868055555555555 | 0 |
| 0.7875 | 0 |
| 0.7881944444444445 | 0 |
| 0.7888888888888889 | 0 |
| 0.7895833333333333 | 0 |
| 0.7902777777777777 | 0 |
| 0.7909722222222223 | 0 |
| 0.7916666666666666 | 0 |
| 0.7923611111111111 | 0 |
| 0.7930555555555556 | 0 |
| 0.7937500000000001 | 0 |
| 0.7944444444444444 | 0 |
| 0.7951388888888888 | 0 |
| 0.7958333333333334 | 0 |
| 0.7965277777777778 | 0 |
| 0.7972222222222222 | 0 |
| 0.7979166666666666 | 0 |
| 0.7986111111111112 | 0 |
| 0.7993055555555556 | 0 |
| 0.7999999999999999 | 0 |
| 0.8006944444444444 | 0 |
| 0.8013888888888889 | 0 |
| 0.8020833333333334 | 0 |
| 0.8027777777777777 | 0 |
| 0.8034722222222223 | 0 |
| 0.8041666666666667 | 0 |
| 0.8048611111111111 | 0 |
| 0.8055555555555555 | 0 |
| 0.80625 | 0 |
| 0.8069444444444445 | 0 |
| 0.8076388888888889 | 0 |
| 0.8083333333333332 | 0 |
| 0.8090277777777778 | 0 |
| 0.8097222222222222 | 0 |
| 0.8104166666666667 | 0 |
| 0.811111111111111 | 0 |
| 0.8118055555555556 | 0 |
| 0.8125 | 0 |
| 0.8131944444444444 | 0 |
| 0.813888888888889 | 0 |
| 0.8145833333333333 | 0 |
| 0.8152777777777778 | 0 |
| 0.8159722222222222 | 0 |
| 0.8166666666666668 | 0 |
| 0.8173611111111111 | 0 |
| 0.8180555555555555 | 0 |
| 0.81875 | 0 |
| 0.8194444444444445 | 0 |
| 0.8201388888888889 | 0 |
| 0.8208333333333333 | 0 |
| 0.8215277777777777 | 0 |
| 0.8222222222222223 | 0 |
| 0.8229166666666666 | 0 |
| 0.8236111111111111 | 0 |
| 0.8243055555555556 | 0 |
| 0.8250000000000001 | 0 |
| 0.8256944444444444 | 0 |
| 0.8263888888888888 | 0 |
| 0.8270833333333334 | 0 |
| 0.8277777777777778 | 0 |
| 0.8284722222222222 | 0 |
| 0.8291666666666666 | 0 |
| 0.8298611111111112 | 0 |
| 0.8305555555555556 | 0 |
| 0.8312499999999999 | 0 |
| 0.8319444444444444 | 0 |
| 0.8326388888888889 | 0 |
| 0.8333333333333334 | 0 |
| 0.8340277777777777 | 0 |
| 0.8347222222222223 | 0 |
| 0.8354166666666667 | 0 |
| 0.8361111111111111 | 0 |
| 0.8368055555555555 | 0 |
| 0.8375 | 0 |
| 0.8381944444444445 | 0 |
| 0.8388888888888889 | 0 |
| 0.8395833333333332 | 0 |
| 0.8402777777777778 | 0 |
| 0.8409722222222222 | 0 |
| 0.8416666666666667 | 0 |
| 0.842361111111111 | 0 |
| 0.8430555555555556 | 0 |
| 0.84375 | 0 |
| 0.8444444444444444 | 0 |
| 0.845138888888889 | 0 |
| 0.8458333333333333 | 0 |
| 0.8465277777777778 | 0 |
| 0.8472222222222222 | 0 |
| 0.8479166666666668 | 0 |
| 0.8486111111111111 | 0 |
| 0.8493055555555555 | 0 |
| 0.85 | 0 |
| 0.8506944444444445 | 0 |
| 0.8513888888888889 | 0 |
| 0.8520833333333333 | 0 |
| 0.8527777777777777 | 0 |
| 0.8534722222222223 | 0 |
| 0.8541666666666666 | 0 |
| 0.8548611111111111 | 0 |
| 0.8555555555555556 | 0 |
| 0.8562500000000001 | 0 |
| 0.8569444444444444 | 0 |
| 0.8576388888888888 | 0 |
| 0.8583333333333334 | 0 |
| 0.8590277777777778 | 0 |
| 0.8597222222222222 | 0 |
| 0.8604166666666666 | 0 |
| 0.8611111111111112 | 0 |
| 0.8618055555555556 | 0 |
| 0.8624999999999999 | 0 |
| 0.8631944444444444 | 0 |
| 0.8638888888888889 | 0 |
| 0.8645833333333334 | 0 |
| 0.8652777777777777 | 0 |
| 0.8659722222222223 | 0 |
| 0.8666666666666667 | 0 |
| 0.8673611111111111 | 0 |
| 0.8680555555555555 | 0 |
| 0.86875 | 0 |
| 0.8694444444444445 | 0 |
| 0.8701388888888889 | 0 |
| 0.8708333333333332 | 0 |
| 0.8715277777777778 | 0 |
| 0.8722222222222222 | 0 |
| 0.8729166666666667 | 0 |
| 0.873611111111111 | 0 |
| 0.8743055555555556 | 0 |
| 0.875 | 0 |
| 0.8756944444444444 | 0 |
| 0.876388888888889 | 0 |
| 0.8770833333333333 | 0 |
| 0.8777777777777778 | 0 |
| 0.8784722222222222 | 0 |
| 0.8791666666666668 | 0 |
| 0.8798611111111111 | 0 |
| 0.8805555555555555 | 0 |
| 0.88125 | 0 |
| 0.8819444444444445 | 0 |
| 0.8826388888888889 | 0 |
| 0.8833333333333333 | 0 |
| 0.8840277777777777 | 0 |
| 0.8847222222222223 | 0 |
| 0.8854166666666666 | 0 |
| 0.8861111111111111 | 0 |
| 0.8868055555555556 | 0 |
| 0.8875000000000001 | 0 |
| 0.8881944444444444 | 0 |
| 0.8888888888888888 | 0 |
| 0.8895833333333334 | 0 |
| 0.8902777777777778 | 0 |
| 0.8909722222222222 | 0 |
| 0.8916666666666666 | 0 |
| 0.8923611111111112 | 0 |
| 0.8930555555555556 | 0 |
| 0.8937499999999999 | 0 |
| 0.8944444444444444 | 0 |
| 0.8951388888888889 | 0 |
| 0.8958333333333334 | 0 |
| 0.8965277777777777 | 0 |
| 0.8972222222222223 | 0 |
| 0.8979166666666667 | 0 |
| 0.8986111111111111 | 0 |
| 0.8993055555555555 | 0 |
| 0.9 | 0 |
| 0.9006944444444445 | 0 |
| 0.9013888888888889 | 0 |
| 0.9020833333333332 | 0 |
| 0.9027777777777778 | 0 |
| 0.9034722222222222 | 0 |
| 0.9041666666666667 | 0 |
| 0.904861111111111 | 0 |
| 0.9055555555555556 | 0 |
| 0.90625 | 0 |
| 0.9069444444444444 | 0 |
| 0.907638888888889 | 0 |
| 0.9083333333333333 | 0 |
| 0.9090277777777778 | 0 |
| 0.9097222222222222 | 0 |
| 0.9104166666666668 | 0 |
| 0.9111111111111111 | 0 |
| 0.9118055555555555 | 0 |
| 0.9125 | 0 |
| 0.9131944444444445 | 0 |
| 0.9138888888888889 | 0 |
| 0.9145833333333333 | 0 |
| 0.9152777777777777 | 0 |
| 0.9159722222222223 | 0 |
| 0.9166666666666666 | 0 |
| 0.9173611111111111 | 0 |
| 0.9180555555555556 | 0 |
| 0.9187500000000001 | 0 |
| 0.9194444444444444 | 0 |
| 0.9201388888888888 | 0 |
| 0.9208333333333334 | 0 |
| 0.9215277777777778 | 0 |
| 0.9222222222222222 | 0 |
| 0.9229166666666666 | 0 |
| 0.9236111111111112 | 0 |
| 0.9243055555555556 | 0 |
| 0.9249999999999999 | 0 |
| 0.9256944444444444 | 0 |
| 0.9263888888888889 | 0 |
| 0.9270833333333334 | 0 |
| 0.9277777777777777 | 0 |
| 0.9284722222222223 | 0 |
| 0.9291666666666667 | 0 |
| 0.9298611111111111 | 0 |
| 0.9305555555555555 | 0 |
| 0.93125 | 0 |
| 0.9319444444444445 | 0 |
| 0.9326388888888889 | 0 |
| 0.9333333333333332 | 0 |
| 0.9340277777777778 | 0 |
| 0.9347222222222222 | 0 |
| 0.9354166666666667 | 0 |
| 0.936111111111111 | 0 |
| 0.9368055555555556 | 0 |
| 0.9375 | 0 |
| 0.9381944444444444 | 0 |
| 0.938888888888889 | 0 |
| 0.9395833333333333 | 0 |
| 0.9402777777777778 | 0 |
| 0.9409722222222222 | 0 |
| 0.9416666666666668 | 0 |
| 0.9423611111111111 | 0 |
| 0.9430555555555555 | 0 |
| 0.94375 | 0 |
| 0.9444444444444445 | 0 |
| 0.9451388888888889 | 0 |
| 0.9458333333333333 | 0 |
| 0.9465277777777777 | 0 |
| 0.9472222222222223 | 0 |
| 0.9479166666666666 | 0 |
| 0.9486111111111111 | 0 |
| 0.9493055555555556 | 0 |
| 0.9500000000000001 | 0 |
| 0.9506944444444444 | 0 |
| 0.9513888888888888 | 0 |
| 0.9520833333333334 | 0 |
| 0.9527777777777778 | 0 |
| 0.9534722222222222 | 0 |
| 0.9541666666666666 | 0 |
| 0.9548611111111112 | 0 |
| 0.9555555555555556 | 0 |
| 0.9562499999999999 | 0 |
| 0.9569444444444444 | 0 |
| 0.9576388888888889 | 0 |
| 0.9583333333333334 | 0 |
| 0.9590277777777777 | 0 |
| 0.9597222222222223 | 0 |
| 0.9604166666666667 | 0 |
| 0.9611111111111111 | 0 |
| 0.9618055555555555 | 0 |
| 0.9625 | 0 |
| 0.9631944444444445 | 0 |
| 0.9638888888888889 | 0 |
| 0.9645833333333332 | 0 |
| 0.9652777777777778 | 0 |
| 0.9659722222222222 | 0 |
| 0.9666666666666667 | 0 |
| 0.967361111111111 | 0 |
| 0.9680555555555556 | 0 |
| 0.96875 | 0 |
| 0.9694444444444444 | 0 |
| 0.970138888888889 | 0 |
| 0.9708333333333333 | 0 |
| 0.9715277777777778 | 0 |
| 0.9722222222222222 | 0 |
| 0.9729166666666668 | 0 |
| 0.9736111111111111 | 0 |
| 0.9743055555555555 | 0 |
| 0.975 | 0 |
| 0.9756944444444445 | 0 |
| 0.9763888888888889 | 0 |
| 0.9770833333333333 | 0 |
| 0.9777777777777777 | 0 |
| 0.9784722222222223 | 0 |
| 0.9791666666666666 | 0 |
| 0.9798611111111111 | 0 |
| 0.9805555555555556 | 0 |
| 0.9812500000000001 | 0 |
| 0.9819444444444444 | 0 |
| 0.9826388888888888 | 0 |
| 0.9833333333333334 | 0 |
| 0.9840277777777778 | 0 |
| 0.9847222222222222 | 0 |
| 0.9854166666666666 | 0 |
| 0.9861111111111112 | 0 |
| 0.9868055555555556 | 0 |
| 0.9874999999999999 | 0 |
| 0.9881944444444444 | 0 |
| 0.9888888888888889 | 0 |
| 0.9895833333333334 | 0 |
| 0.9902777777777777 | 0 |
| 0.9909722222222223 | 0 |
| 0.9916666666666667 | 0 |
| 0.9923611111111111 | 0 |
| 0.9930555555555555 | 0 |
| 0.99375 | 0 |
| 0.9944444444444445 | 0 |
| 0.9951388888888889 | 0 |
| 0.9958333333333332 | 0 |
| 0.9965277777777778 | 0 |
| 0.9972222222222222 | 0 |
| 0.9979166666666667 | 0 |
| 0.998611111111111 | 0 |
| 0.9993055555555556 | 0 |